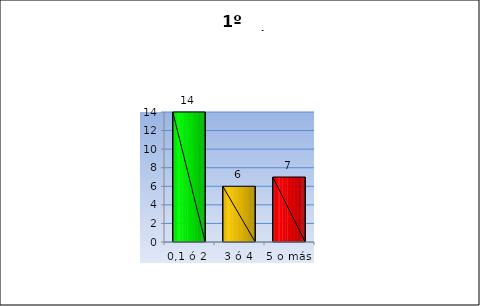
| Category | 1º GESTION |
|---|---|
| 0,1 ó 2  | 14 |
| 3 ó 4 | 6 |
| 5 o más | 7 |